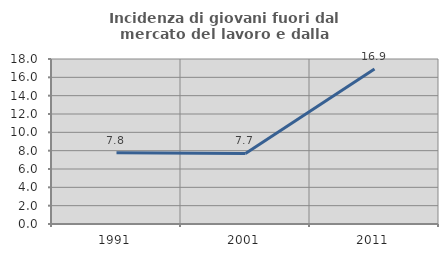
| Category | Incidenza di giovani fuori dal mercato del lavoro e dalla formazione  |
|---|---|
| 1991.0 | 7.778 |
| 2001.0 | 7.692 |
| 2011.0 | 16.901 |